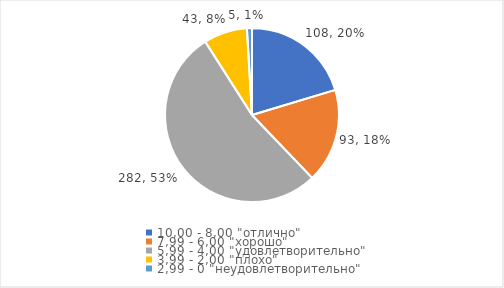
| Category | Series 0 | Series 1 |
|---|---|---|
| 10,00 - 8,00 "отлично" | 108 | 0.203 |
| 7,99 - 6,00 "хорошо" | 93 | 0.175 |
| 5,99 - 4,00 "удовлетворительно" | 282 | 0.531 |
| 3,99 - 2,00 "плохо" | 43 | 0.081 |
| 2,99 - 0 "неудовлетворительно" | 5 | 0.009 |